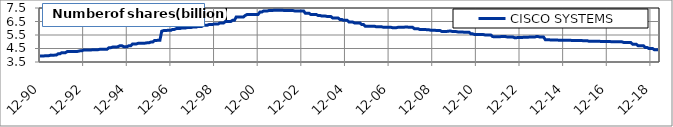
| Category | CISCO SYSTEMS |
|---|---|
| 1990-12-31 | 3.941 |
| 1991-01-31 | 3.941 |
| 1991-02-28 | 3.94 |
| 1991-03-29 | 3.971 |
| 1991-04-30 | 3.972 |
| 1991-05-31 | 3.971 |
| 1991-06-28 | 4.009 |
| 1991-07-31 | 4.009 |
| 1991-08-30 | 4.009 |
| 1991-09-30 | 4.009 |
| 1991-10-31 | 4.106 |
| 1991-11-29 | 4.106 |
| 1991-12-31 | 4.189 |
| 1992-01-31 | 4.189 |
| 1992-02-28 | 4.189 |
| 1992-03-31 | 4.27 |
| 1992-04-30 | 4.269 |
| 1992-05-29 | 4.27 |
| 1992-06-30 | 4.27 |
| 1992-07-31 | 4.269 |
| 1992-08-31 | 4.27 |
| 1992-09-30 | 4.295 |
| 1992-10-30 | 4.328 |
| 1992-11-30 | 4.328 |
| 1992-12-31 | 4.387 |
| 1993-01-29 | 4.387 |
| 1993-02-26 | 4.387 |
| 1993-03-31 | 4.387 |
| 1993-04-30 | 4.387 |
| 1993-05-31 | 4.413 |
| 1993-06-30 | 4.413 |
| 1993-07-30 | 4.413 |
| 1993-08-31 | 4.413 |
| 1993-09-30 | 4.443 |
| 1993-10-29 | 4.453 |
| 1993-11-30 | 4.453 |
| 1993-12-31 | 4.453 |
| 1994-01-31 | 4.453 |
| 1994-02-28 | 4.56 |
| 1994-03-31 | 4.56 |
| 1994-04-29 | 4.608 |
| 1994-05-31 | 4.608 |
| 1994-06-30 | 4.608 |
| 1994-07-29 | 4.632 |
| 1994-08-31 | 4.708 |
| 1994-09-30 | 4.708 |
| 1994-10-31 | 4.638 |
| 1994-11-30 | 4.638 |
| 1994-12-30 | 4.638 |
| 1995-01-31 | 4.708 |
| 1995-02-28 | 4.708 |
| 1995-03-31 | 4.836 |
| 1995-04-28 | 4.836 |
| 1995-05-31 | 4.836 |
| 1995-06-30 | 4.884 |
| 1995-07-31 | 4.884 |
| 1995-08-31 | 4.884 |
| 1995-09-29 | 4.884 |
| 1995-10-31 | 4.9 |
| 1995-11-30 | 4.925 |
| 1995-12-29 | 4.925 |
| 1996-01-31 | 4.972 |
| 1996-02-29 | 4.972 |
| 1996-03-29 | 5.089 |
| 1996-04-30 | 5.089 |
| 1996-05-31 | 5.116 |
| 1996-06-28 | 5.116 |
| 1996-07-31 | 5.778 |
| 1996-08-30 | 5.825 |
| 1996-09-30 | 5.825 |
| 1996-10-31 | 5.843 |
| 1996-11-29 | 5.843 |
| 1996-12-31 | 5.843 |
| 1997-01-31 | 5.916 |
| 1997-02-28 | 5.916 |
| 1997-03-31 | 5.973 |
| 1997-04-30 | 5.973 |
| 1997-05-30 | 5.972 |
| 1997-06-30 | 6.022 |
| 1997-07-31 | 6.022 |
| 1997-08-29 | 6.022 |
| 1997-09-30 | 6.049 |
| 1997-10-31 | 6.049 |
| 1997-11-28 | 6.049 |
| 1997-12-31 | 6.088 |
| 1998-01-30 | 6.088 |
| 1998-02-27 | 6.088 |
| 1998-03-31 | 6.138 |
| 1998-04-30 | 6.138 |
| 1998-05-29 | 6.138 |
| 1998-06-30 | 6.219 |
| 1998-07-31 | 6.219 |
| 1998-08-31 | 6.219 |
| 1998-09-30 | 6.277 |
| 1998-10-30 | 6.277 |
| 1998-11-30 | 6.283 |
| 1998-12-31 | 6.316 |
| 1999-01-29 | 6.316 |
| 1999-02-26 | 6.316 |
| 1999-03-31 | 6.389 |
| 1999-04-30 | 6.389 |
| 1999-05-31 | 6.389 |
| 1999-06-30 | 6.502 |
| 1999-07-30 | 6.502 |
| 1999-08-31 | 6.502 |
| 1999-09-30 | 6.502 |
| 1999-10-29 | 6.595 |
| 1999-11-30 | 6.595 |
| 1999-12-31 | 6.842 |
| 2000-01-31 | 6.842 |
| 2000-02-29 | 6.842 |
| 2000-03-31 | 6.842 |
| 2000-04-28 | 6.842 |
| 2000-05-31 | 6.956 |
| 2000-06-30 | 7.024 |
| 2000-07-31 | 7.024 |
| 2000-08-31 | 7.024 |
| 2000-09-29 | 7.024 |
| 2000-10-31 | 7.024 |
| 2000-11-30 | 7.024 |
| 2000-12-29 | 7.024 |
| 2001-01-31 | 7.197 |
| 2001-02-28 | 7.197 |
| 2001-03-30 | 7.276 |
| 2001-04-30 | 7.276 |
| 2001-05-31 | 7.276 |
| 2001-06-29 | 7.319 |
| 2001-07-31 | 7.319 |
| 2001-08-31 | 7.319 |
| 2001-09-28 | 7.334 |
| 2001-10-31 | 7.334 |
| 2001-11-30 | 7.335 |
| 2001-12-31 | 7.335 |
| 2002-01-31 | 7.335 |
| 2002-02-28 | 7.321 |
| 2002-03-29 | 7.321 |
| 2002-04-30 | 7.321 |
| 2002-05-31 | 7.317 |
| 2002-06-28 | 7.317 |
| 2002-07-31 | 7.317 |
| 2002-08-30 | 7.286 |
| 2002-09-30 | 7.286 |
| 2002-10-31 | 7.286 |
| 2002-11-29 | 7.286 |
| 2002-12-31 | 7.286 |
| 2003-01-31 | 7.286 |
| 2003-02-28 | 7.112 |
| 2003-03-31 | 7.112 |
| 2003-04-30 | 7.112 |
| 2003-05-30 | 7.019 |
| 2003-06-30 | 7.019 |
| 2003-07-31 | 7.019 |
| 2003-08-29 | 7.019 |
| 2003-09-30 | 6.948 |
| 2003-10-31 | 6.948 |
| 2003-11-28 | 6.903 |
| 2003-12-31 | 6.903 |
| 2004-01-30 | 6.903 |
| 2004-02-27 | 6.873 |
| 2004-03-31 | 6.873 |
| 2004-04-30 | 6.873 |
| 2004-05-31 | 6.761 |
| 2004-06-30 | 6.761 |
| 2004-07-30 | 6.761 |
| 2004-08-31 | 6.761 |
| 2004-09-30 | 6.65 |
| 2004-10-29 | 6.653 |
| 2004-11-30 | 6.585 |
| 2004-12-31 | 6.585 |
| 2005-01-31 | 6.585 |
| 2005-02-28 | 6.464 |
| 2005-03-31 | 6.464 |
| 2005-04-29 | 6.464 |
| 2005-05-31 | 6.391 |
| 2005-06-30 | 6.391 |
| 2005-07-29 | 6.391 |
| 2005-08-31 | 6.391 |
| 2005-09-30 | 6.275 |
| 2005-10-31 | 6.275 |
| 2005-11-30 | 6.143 |
| 2005-12-30 | 6.143 |
| 2006-01-31 | 6.143 |
| 2006-02-28 | 6.151 |
| 2006-03-31 | 6.151 |
| 2006-04-28 | 6.151 |
| 2006-05-31 | 6.105 |
| 2006-06-30 | 6.105 |
| 2006-07-31 | 6.105 |
| 2006-08-31 | 6.105 |
| 2006-09-29 | 6.07 |
| 2006-10-31 | 6.07 |
| 2006-11-30 | 6.073 |
| 2006-12-29 | 6.073 |
| 2007-01-31 | 6.073 |
| 2007-02-28 | 6.04 |
| 2007-03-30 | 6.04 |
| 2007-04-30 | 6.04 |
| 2007-05-31 | 6.071 |
| 2007-06-29 | 6.071 |
| 2007-07-31 | 6.071 |
| 2007-08-31 | 6.071 |
| 2007-09-28 | 6.091 |
| 2007-10-31 | 6.091 |
| 2007-11-30 | 6.067 |
| 2007-12-31 | 6.067 |
| 2008-01-31 | 6.067 |
| 2008-02-29 | 5.961 |
| 2008-03-31 | 5.961 |
| 2008-04-30 | 5.961 |
| 2008-05-30 | 5.907 |
| 2008-06-30 | 5.907 |
| 2008-07-31 | 5.907 |
| 2008-08-29 | 5.907 |
| 2008-09-30 | 5.883 |
| 2008-10-31 | 5.883 |
| 2008-11-28 | 5.855 |
| 2008-12-31 | 5.855 |
| 2009-01-30 | 5.855 |
| 2009-02-27 | 5.837 |
| 2009-03-31 | 5.837 |
| 2009-04-30 | 5.837 |
| 2009-05-29 | 5.768 |
| 2009-06-30 | 5.768 |
| 2009-07-31 | 5.768 |
| 2009-08-31 | 5.768 |
| 2009-09-30 | 5.789 |
| 2009-10-30 | 5.789 |
| 2009-11-30 | 5.753 |
| 2009-12-31 | 5.753 |
| 2010-01-29 | 5.753 |
| 2010-02-26 | 5.726 |
| 2010-03-31 | 5.726 |
| 2010-04-30 | 5.726 |
| 2010-05-31 | 5.711 |
| 2010-06-30 | 5.711 |
| 2010-07-30 | 5.711 |
| 2010-08-31 | 5.711 |
| 2010-09-30 | 5.585 |
| 2010-10-29 | 5.585 |
| 2010-11-30 | 5.543 |
| 2010-12-31 | 5.543 |
| 2011-01-31 | 5.543 |
| 2011-02-28 | 5.528 |
| 2011-03-31 | 5.528 |
| 2011-04-29 | 5.528 |
| 2011-05-31 | 5.5 |
| 2011-06-30 | 5.5 |
| 2011-07-29 | 5.5 |
| 2011-08-31 | 5.5 |
| 2011-09-30 | 5.383 |
| 2011-10-31 | 5.365 |
| 2011-11-30 | 5.376 |
| 2011-12-30 | 5.376 |
| 2012-01-31 | 5.376 |
| 2012-02-29 | 5.386 |
| 2012-03-30 | 5.386 |
| 2012-04-30 | 5.386 |
| 2012-05-31 | 5.357 |
| 2012-06-29 | 5.357 |
| 2012-07-31 | 5.357 |
| 2012-08-31 | 5.357 |
| 2012-09-28 | 5.302 |
| 2012-10-31 | 5.302 |
| 2012-11-30 | 5.309 |
| 2012-12-31 | 5.309 |
| 2013-01-31 | 5.309 |
| 2013-02-28 | 5.332 |
| 2013-03-29 | 5.332 |
| 2013-04-30 | 5.332 |
| 2013-05-31 | 5.344 |
| 2013-06-28 | 5.344 |
| 2013-07-31 | 5.344 |
| 2013-08-30 | 5.344 |
| 2013-09-30 | 5.384 |
| 2013-10-31 | 5.384 |
| 2013-11-30 | 5.347 |
| 2013-12-31 | 5.347 |
| 2014-01-31 | 5.347 |
| 2014-02-28 | 5.151 |
| 2014-03-31 | 5.151 |
| 2014-04-30 | 5.151 |
| 2014-05-31 | 5.123 |
| 2014-06-30 | 5.123 |
| 2014-07-31 | 5.123 |
| 2014-08-31 | 5.123 |
| 2014-09-30 | 5.12 |
| 2014-10-31 | 5.12 |
| 2014-11-30 | 5.114 |
| 2014-12-31 | 5.114 |
| 2015-01-30 | 5.114 |
| 2015-02-27 | 5.105 |
| 2015-03-31 | 5.105 |
| 2015-04-30 | 5.105 |
| 2015-05-29 | 5.086 |
| 2015-06-30 | 5.086 |
| 2015-07-31 | 5.086 |
| 2015-08-31 | 5.086 |
| 2015-09-30 | 5.087 |
| 2015-10-30 | 5.087 |
| 2015-11-30 | 5.076 |
| 2015-12-31 | 5.076 |
| 2016-01-29 | 5.076 |
| 2016-02-29 | 5.032 |
| 2016-03-31 | 5.032 |
| 2016-04-29 | 5.032 |
| 2016-05-31 | 5.03 |
| 2016-06-30 | 5.03 |
| 2016-07-29 | 5.03 |
| 2016-08-31 | 5.03 |
| 2016-09-30 | 5.014 |
| 2016-10-31 | 5.026 |
| 2016-11-30 | 5.02 |
| 2016-12-30 | 5.02 |
| 2017-01-31 | 5.02 |
| 2017-02-28 | 5.008 |
| 2017-03-31 | 5.008 |
| 2017-04-28 | 5.008 |
| 2017-05-31 | 5 |
| 2017-06-30 | 5 |
| 2017-07-31 | 5 |
| 2017-08-31 | 5 |
| 2017-09-29 | 4.952 |
| 2017-10-31 | 4.952 |
| 2017-11-30 | 4.944 |
| 2017-12-29 | 4.944 |
| 2018-01-31 | 4.944 |
| 2018-02-28 | 4.818 |
| 2018-03-30 | 4.818 |
| 2018-04-30 | 4.818 |
| 2018-05-31 | 4.703 |
| 2018-06-29 | 4.703 |
| 2018-07-31 | 4.703 |
| 2018-08-31 | 4.703 |
| 2018-09-28 | 4.571 |
| 2018-10-31 | 4.571 |
| 2018-11-30 | 4.496 |
| 2018-12-31 | 4.496 |
| 2019-01-31 | 4.496 |
| 2019-02-28 | 4.402 |
| 2019-03-29 | 4.402 |
| 2019-04-30 | 4.402 |